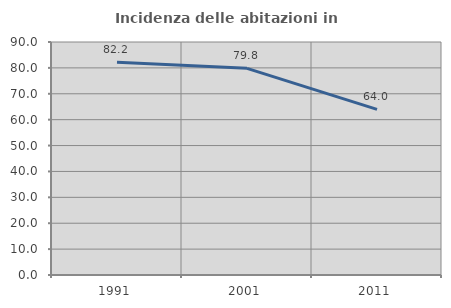
| Category | Incidenza delle abitazioni in proprietà  |
|---|---|
| 1991.0 | 82.166 |
| 2001.0 | 79.837 |
| 2011.0 | 63.971 |